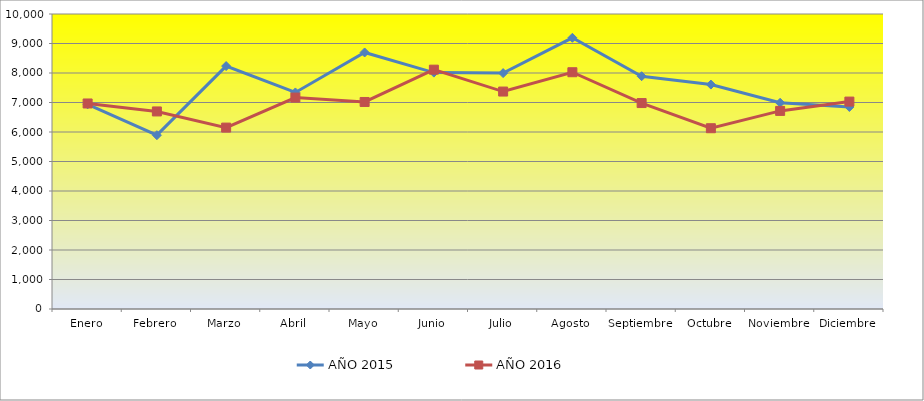
| Category | AÑO 2015 | AÑO 2016 |
|---|---|---|
| Enero | 6937 | 6967 |
| Febrero | 5892 | 6697 |
| Marzo | 8235 | 6149 |
| Abril | 7341 | 7167 |
| Mayo | 8696 | 7018 |
| Junio | 8013 | 8113 |
| Julio | 7996 | 7371 |
| Agosto | 9193 | 8026 |
| Septiembre | 7891 | 6981 |
| Octubre | 7608 | 6128 |
| Noviembre | 6990 | 6715 |
| Diciembre | 6848 | 7031 |